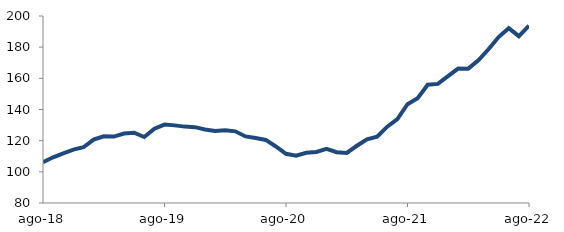
| Category | Series 0 |
|---|---|
| 2018-08-01 | 106.194 |
| 2018-09-01 | 109.327 |
| 2018-10-01 | 111.815 |
| 2018-11-01 | 114.242 |
| 2018-12-01 | 115.778 |
| 2019-01-01 | 120.689 |
| 2019-02-01 | 122.792 |
| 2019-03-01 | 122.605 |
| 2019-04-01 | 124.541 |
| 2019-05-01 | 125.115 |
| 2019-06-01 | 122.365 |
| 2019-07-01 | 127.653 |
| 2019-08-01 | 130.323 |
| 2019-09-01 | 129.814 |
| 2019-10-01 | 129.013 |
| 2019-11-01 | 128.663 |
| 2019-12-01 | 127.192 |
| 2020-01-01 | 126.144 |
| 2020-02-01 | 126.638 |
| 2020-03-01 | 125.992 |
| 2020-04-01 | 122.726 |
| 2020-05-01 | 121.669 |
| 2020-06-01 | 120.485 |
| 2020-07-01 | 116.268 |
| 2020-08-01 | 111.597 |
| 2020-09-01 | 110.39 |
| 2020-10-01 | 112.229 |
| 2020-11-01 | 112.769 |
| 2020-12-01 | 114.741 |
| 2021-01-01 | 112.625 |
| 2021-02-01 | 112.14 |
| 2021-03-01 | 116.74 |
| 2021-04-01 | 120.911 |
| 2021-05-01 | 122.536 |
| 2021-06-01 | 128.968 |
| 2021-07-01 | 133.864 |
| 2021-08-01 | 143.384 |
| 2021-09-01 | 147.196 |
| 2021-10-01 | 155.883 |
| 2021-11-01 | 156.426 |
| 2021-12-01 | 161.4 |
| 2022-01-01 | 166.276 |
| 2022-02-01 | 166.219 |
| 2022-03-01 | 171.531 |
| 2022-04-01 | 178.644 |
| 2022-05-01 | 186.465 |
| 2022-06-01 | 192.187 |
| 2022-07-01 | 187.044 |
| 2022-08-01 | 193.806 |